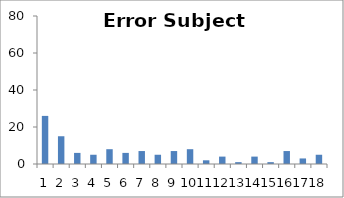
| Category | Sub8 |
|---|---|
| 0 | 26 |
| 1 | 15 |
| 2 | 6 |
| 3 | 5 |
| 4 | 8 |
| 5 | 6 |
| 6 | 7 |
| 7 | 5 |
| 8 | 7 |
| 9 | 8 |
| 10 | 2 |
| 11 | 4 |
| 12 | 1 |
| 13 | 4 |
| 14 | 1 |
| 15 | 7 |
| 16 | 3 |
| 17 | 5 |